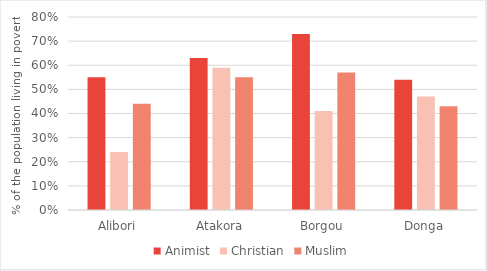
| Category | Animist | Christian | Muslim |
|---|---|---|---|
| Alibori | 0.55 | 0.24 | 0.44 |
| Atakora | 0.63 | 0.59 | 0.55 |
| Borgou | 0.73 | 0.41 | 0.57 |
| Donga | 0.54 | 0.47 | 0.43 |